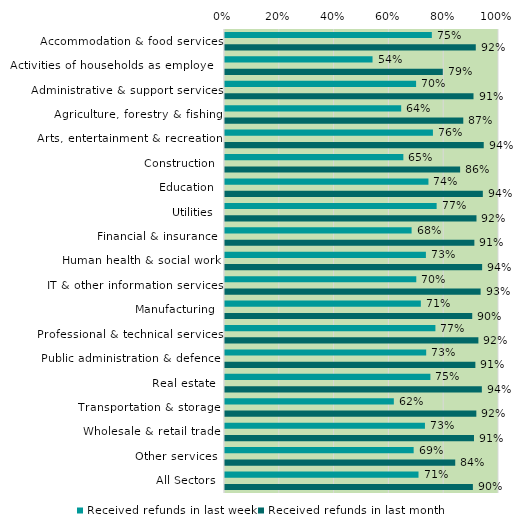
| Category | Received refunds in last week | Received refunds in last month |
|---|---|---|
| Accommodation & food services | 0.755 | 0.915 |
| Activities of households as employers | 0.538 | 0.795 |
| Administrative & support services | 0.697 | 0.907 |
| Agriculture, forestry & fishing | 0.643 | 0.87 |
| Arts, entertainment & recreation | 0.759 | 0.944 |
| Construction | 0.651 | 0.858 |
| Education | 0.742 | 0.941 |
| Utilities | 0.772 | 0.918 |
| Financial & insurance | 0.681 | 0.91 |
| Human health & social work | 0.733 | 0.938 |
| IT & other information services | 0.698 | 0.933 |
| Manufacturing | 0.715 | 0.902 |
| Professional & technical services | 0.768 | 0.925 |
| Public administration & defence | 0.734 | 0.914 |
| Real estate | 0.75 | 0.937 |
| Transportation & storage | 0.616 | 0.917 |
| Wholesale & retail trade | 0.73 | 0.909 |
| Other services | 0.689 | 0.84 |
| All Sectors | 0.706 | 0.905 |